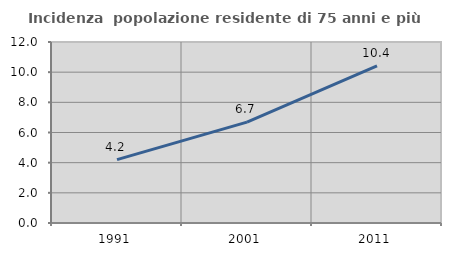
| Category | Incidenza  popolazione residente di 75 anni e più |
|---|---|
| 1991.0 | 4.199 |
| 2001.0 | 6.687 |
| 2011.0 | 10.417 |